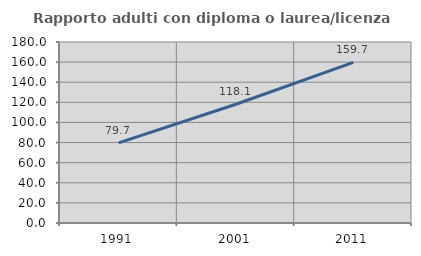
| Category | Rapporto adulti con diploma o laurea/licenza media  |
|---|---|
| 1991.0 | 79.686 |
| 2001.0 | 118.12 |
| 2011.0 | 159.684 |